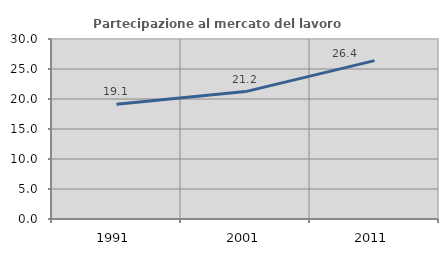
| Category | Partecipazione al mercato del lavoro  femminile |
|---|---|
| 1991.0 | 19.136 |
| 2001.0 | 21.233 |
| 2011.0 | 26.4 |